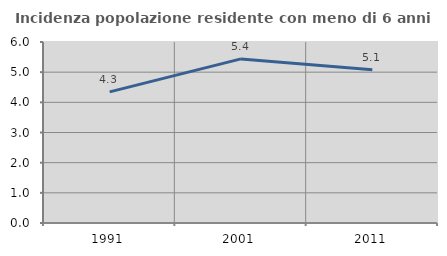
| Category | Incidenza popolazione residente con meno di 6 anni |
|---|---|
| 1991.0 | 4.348 |
| 2001.0 | 5.44 |
| 2011.0 | 5.079 |